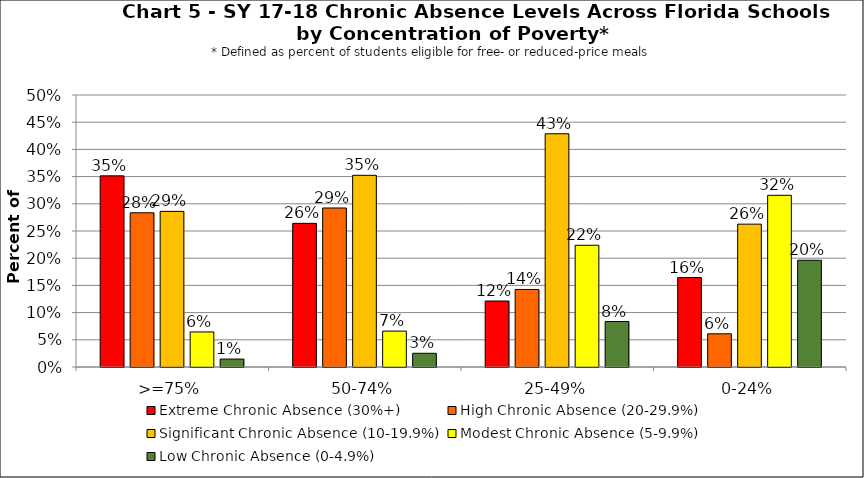
| Category | Extreme Chronic Absence (30%+) | High Chronic Absence (20-29.9%) | Significant Chronic Absence (10-19.9%) | Modest Chronic Absence (5-9.9%) | Low Chronic Absence (0-4.9%) |
|---|---|---|---|---|---|
| 0 | 0.351 | 0.284 | 0.286 | 0.064 | 0.015 |
| 1 | 0.264 | 0.292 | 0.352 | 0.066 | 0.025 |
| 2 | 0.121 | 0.143 | 0.429 | 0.224 | 0.084 |
| 3 | 0.164 | 0.061 | 0.263 | 0.316 | 0.196 |